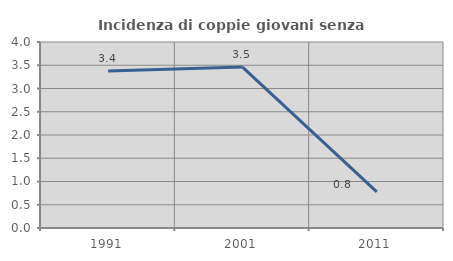
| Category | Incidenza di coppie giovani senza figli |
|---|---|
| 1991.0 | 3.376 |
| 2001.0 | 3.462 |
| 2011.0 | 0.775 |